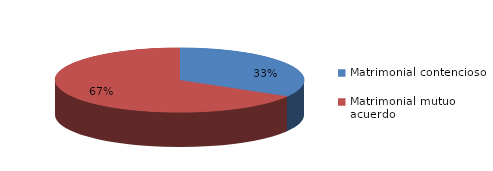
| Category | Series 0 |
|---|---|
| 0 | 234 |
| 1 | 466 |